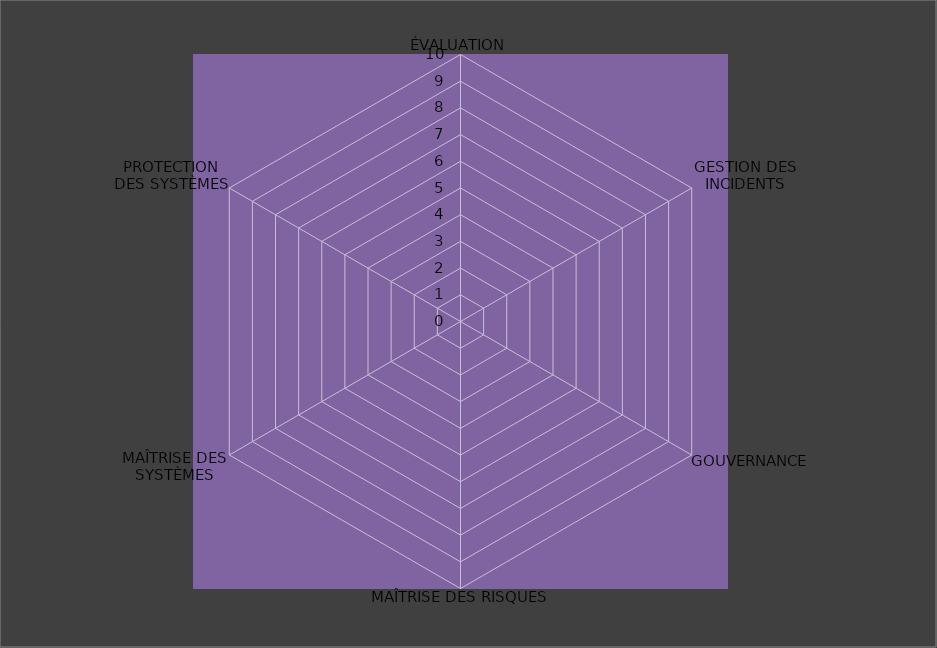
| Category | Année 2019 |
|---|---|
| ÉVALUATION | 0 |
| GESTION DES INCIDENTS | 0 |
| GOUVERNANCE | 0 |
| MAÎTRISE DES RISQUES | 0 |
| MAÎTRISE DES SYSTÈMES | 0 |
| PROTECTION
DES SYSTÈMES | 0 |